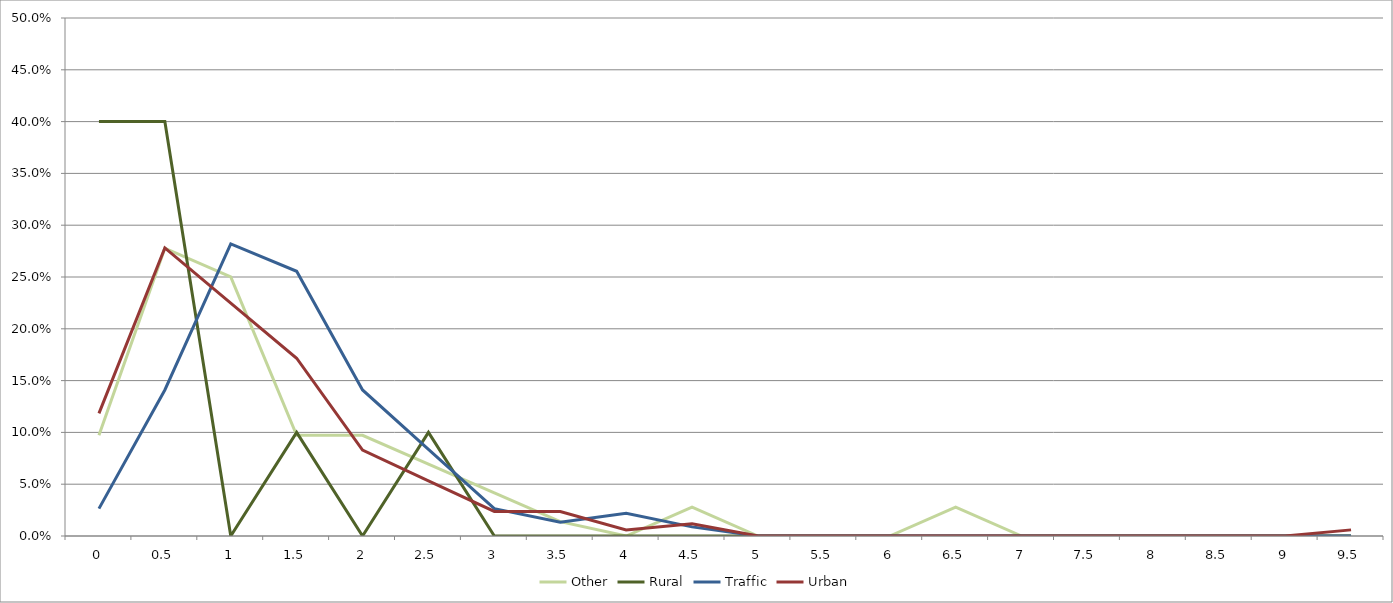
| Category | Other | Rural | Traffic | Urban |
|---|---|---|---|---|
| 0.0 | 0.097 | 0.4 | 0.026 | 0.118 |
| 0.5 | 0.278 | 0.4 | 0.141 | 0.278 |
| 1.0 | 0.25 | 0 | 0.282 | 0.225 |
| 1.5 | 0.097 | 0.1 | 0.256 | 0.172 |
| 2.0 | 0.097 | 0 | 0.141 | 0.083 |
| 2.5 | 0.069 | 0.1 | 0.084 | 0.053 |
| 3.0 | 0.042 | 0 | 0.026 | 0.024 |
| 3.5 | 0.014 | 0 | 0.013 | 0.024 |
| 4.0 | 0 | 0 | 0.022 | 0.006 |
| 4.5 | 0.028 | 0 | 0.009 | 0.012 |
| 5.0 | 0 | 0 | 0 | 0 |
| 5.5 | 0 | 0 | 0 | 0 |
| 6.0 | 0 | 0 | 0 | 0 |
| 6.5 | 0.028 | 0 | 0 | 0 |
| 7.0 | 0 | 0 | 0 | 0 |
| 7.5 | 0 | 0 | 0 | 0 |
| 8.0 | 0 | 0 | 0 | 0 |
| 8.5 | 0 | 0 | 0 | 0 |
| 9.0 | 0 | 0 | 0 | 0 |
| 9.5 | 0 | 0 | 0 | 0.006 |